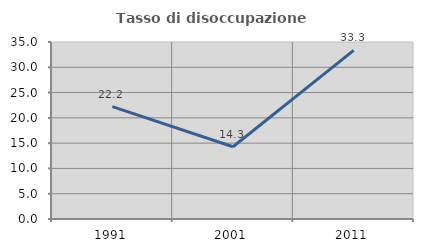
| Category | Tasso di disoccupazione giovanile  |
|---|---|
| 1991.0 | 22.222 |
| 2001.0 | 14.286 |
| 2011.0 | 33.333 |